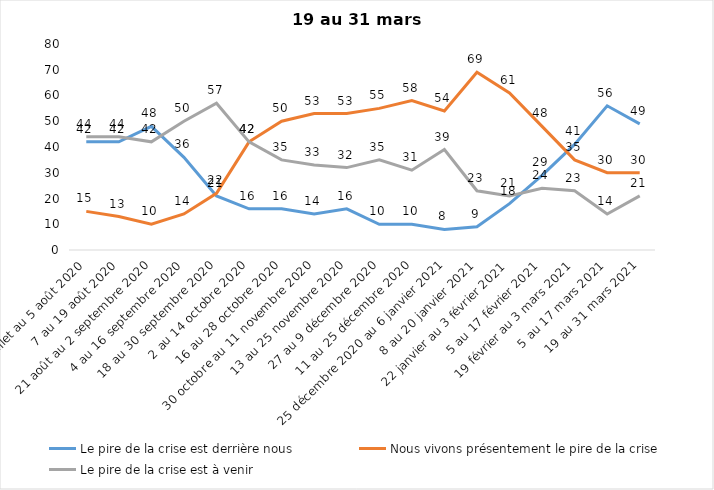
| Category | Le pire de la crise est derrière nous | Nous vivons présentement le pire de la crise | Le pire de la crise est à venir |
|---|---|---|---|
| 24 juillet au 5 août 2020 | 42 | 15 | 44 |
| 7 au 19 août 2020 | 42 | 13 | 44 |
| 21 août au 2 septembre 2020 | 48 | 10 | 42 |
| 4 au 16 septembre 2020 | 36 | 14 | 50 |
| 18 au 30 septembre 2020 | 21 | 22 | 57 |
| 2 au 14 octobre 2020 | 16 | 42 | 42 |
| 16 au 28 octobre 2020 | 16 | 50 | 35 |
| 30 octobre au 11 novembre 2020 | 14 | 53 | 33 |
| 13 au 25 novembre 2020 | 16 | 53 | 32 |
| 27 au 9 décembre 2020 | 10 | 55 | 35 |
| 11 au 25 décembre 2020 | 10 | 58 | 31 |
| 25 décembre 2020 au 6 janvier 2021 | 8 | 54 | 39 |
| 8 au 20 janvier 2021 | 9 | 69 | 23 |
| 22 janvier au 3 février 2021 | 18 | 61 | 21 |
| 5 au 17 février 2021 | 29 | 48 | 24 |
| 19 février au 3 mars 2021 | 41 | 35 | 23 |
| 5 au 17 mars 2021 | 56 | 30 | 14 |
| 19 au 31 mars 2021 | 49 | 30 | 21 |